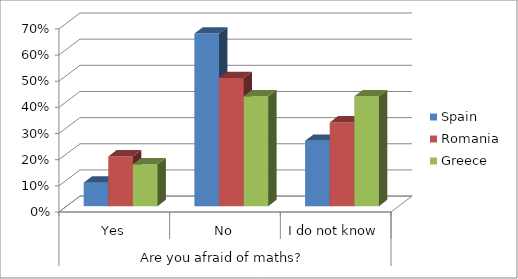
| Category | Spain | Romania | Greece |
|---|---|---|---|
| 0 | 0.09 | 0.19 | 0.16 |
| 1 | 0.66 | 0.49 | 0.42 |
| 2 | 0.25 | 0.32 | 0.42 |